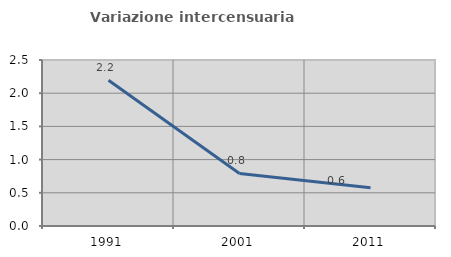
| Category | Variazione intercensuaria annua |
|---|---|
| 1991.0 | 2.194 |
| 2001.0 | 0.791 |
| 2011.0 | 0.575 |